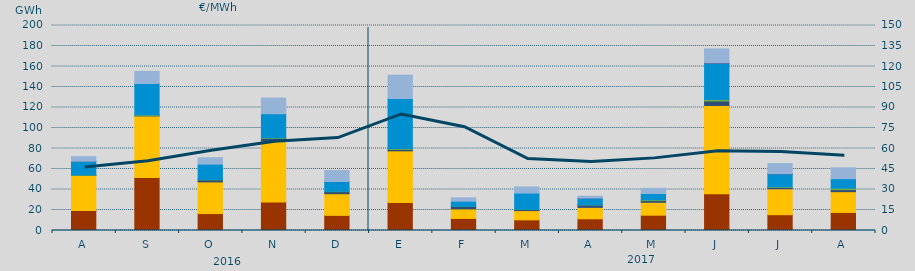
| Category | Carbón | Ciclo Combinado | Cogeneración | Consumo Bombeo | Eólica | Hidráulica | Nuclear | Turbinación bombeo |
|---|---|---|---|---|---|---|---|---|
| A | 19608 | 34074 | 0 | 154.8 | 407.6 | 13164.8 | 150 | 4538.1 |
| S | 51777.2 | 60003.2 | 0 | 418.8 | 585.4 | 30624.4 | 0 | 11791 |
| O | 16527.1 | 30870.5 | 0 | 2014.8 | 341.7 | 14982.5 | 0 | 6233.4 |
| N | 27911.6 | 59353 | 0 | 2603.5 | 562.8 | 23494.9 | 0 | 15319.9 |
| D | 14759.8 | 21112.2 | 0 | 2054.9 | 290 | 9517.7 | 60 | 10705.2 |
| E | 27333.2 | 50390.4 | 0 | 1420.1 | 796.7 | 48799.7 | 0 | 22768.5 |
| F | 11782.3 | 9297.4 | 0 | 2429.3 | 37.7 | 5011.6 | 0 | 3301.6 |
| M | 10392.3 | 9024.8 | 0 | 1213 | 83.9 | 15815.6 | 0 | 5970.4 |
| A | 11417.3 | 11177.4 | 1 | 2298.7 | 146.3 | 6448.1 | 105 | 1824.9 |
| M | 14921.9 | 12578.5 | 0 | 1623.5 | 791 | 6148.7 | 0 | 5041.6 |
| J | 35897.1 | 86103.9 | 16 | 4321.9 | 1499 | 35181.7 | 537 | 13587.3 |
| J | 15424.3 | 25298.7 | 6 | 1196.5 | 694.8 | 12560.8 | 231 | 9853.3 |
| A | 17604.1 | 20278.5 | 0 | 1953.7 | 1479 | 9282.6 | 0 | 10537.6 |